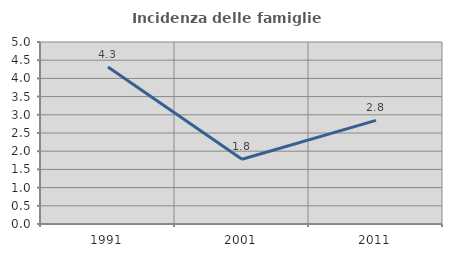
| Category | Incidenza delle famiglie numerose |
|---|---|
| 1991.0 | 4.31 |
| 2001.0 | 1.777 |
| 2011.0 | 2.847 |